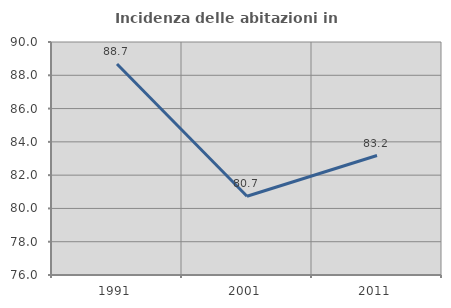
| Category | Incidenza delle abitazioni in proprietà  |
|---|---|
| 1991.0 | 88.679 |
| 2001.0 | 80.734 |
| 2011.0 | 83.178 |